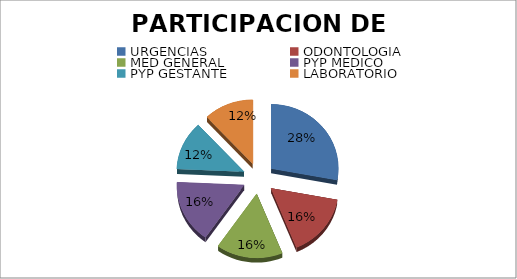
| Category | Series 0 | Series 1 |
|---|---|---|
| URGENCIAS | 70 | 0.279 |
| ODONTOLOGIA | 40 | 0.159 |
| MED GENERAL | 40 | 0.159 |
| PYP MEDICO | 40 | 0.159 |
| PYP GESTANTE | 31 | 0.124 |
| LABORATORIO | 30 | 0.12 |